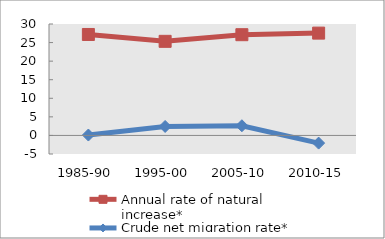
| Category | Annual rate of natural increase* | Crude net migration rate* |
|---|---|---|
| 1985-90 | 27.181 | 0.103 |
| 1995-00 | 25.332 | 2.415 |
| 2005-10 | 27.12 | 2.606 |
| 2010-15 | 27.544 | -2.066 |